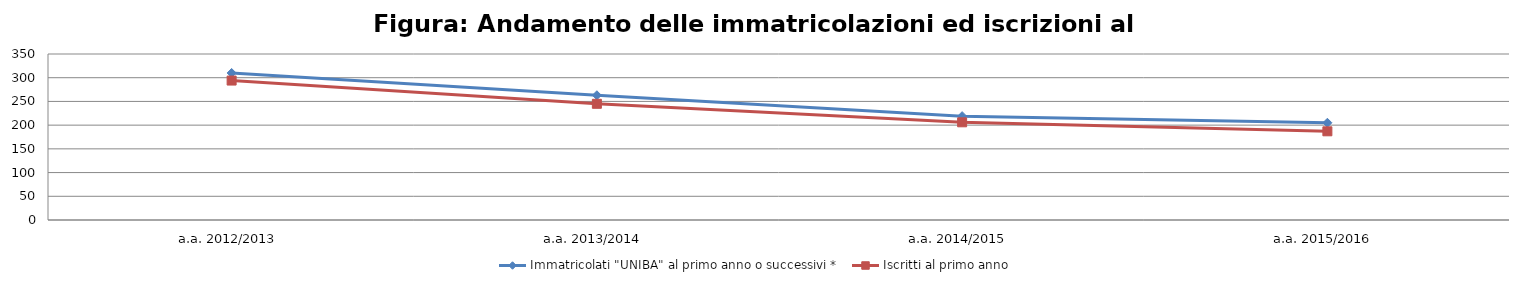
| Category | Immatricolati "UNIBA" al primo anno o successivi * | Iscritti al primo anno  |
|---|---|---|
| a.a. 2012/2013 | 310 | 294 |
| a.a. 2013/2014 | 263 | 245 |
| a.a. 2014/2015 | 219 | 206 |
| a.a. 2015/2016 | 205 | 187 |